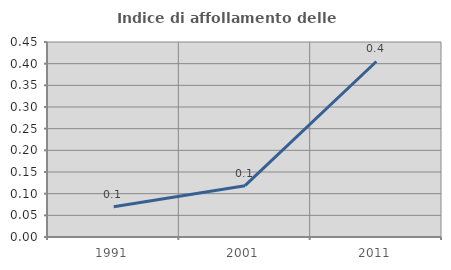
| Category | Indice di affollamento delle abitazioni  |
|---|---|
| 1991.0 | 0.07 |
| 2001.0 | 0.118 |
| 2011.0 | 0.405 |